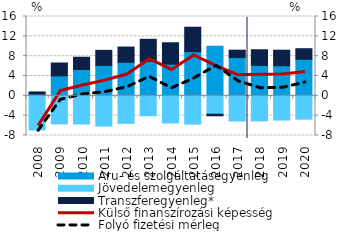
| Category | Áru- és szolgáltatásegyenleg | Jövedelemegyenleg | Transzferegyenleg* |
|---|---|---|---|
| 2008.0 | 0.357 | -6.883 | 0.435 |
| 2009.0 | 4.031 | -5.668 | 2.592 |
| 2010.0 | 5.32 | -5.693 | 2.467 |
| 2011.0 | 6.13 | -6.106 | 3.042 |
| 2012.0 | 6.766 | -5.543 | 3.075 |
| 2013.0 | 6.964 | -4.021 | 4.439 |
| 2014.0 | 6.376 | -5.476 | 4.328 |
| 2015.0 | 8.905 | -5.71 | 4.936 |
| 2016.0 | 10.015 | -3.706 | -0.313 |
| 2017.0 | 7.712 | -5.074 | 1.5 |
| 2018.0 | 6.113 | -5.063 | 3.181 |
| 2019.0 | 6.064 | -4.891 | 3.14 |
| 2020.0 | 7.353 | -4.709 | 2.152 |